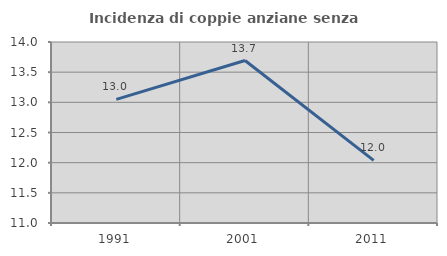
| Category | Incidenza di coppie anziane senza figli  |
|---|---|
| 1991.0 | 13.05 |
| 2001.0 | 13.693 |
| 2011.0 | 12.038 |